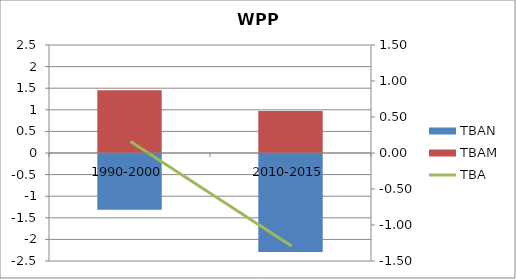
| Category | TBAN | TBAM |
|---|---|---|
| 1990-2000 | -1.292 | 1.451 |
| 2010-2015 | -2.266 | 0.974 |